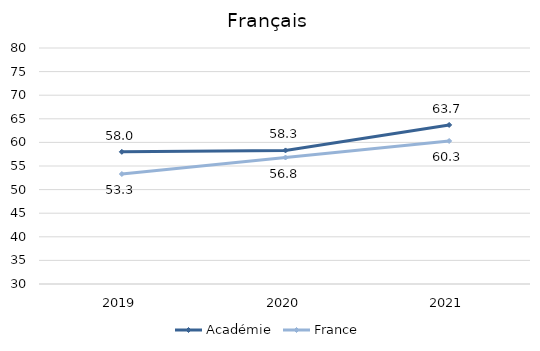
| Category | Académie | France |
|---|---|---|
| 2019.0 | 58 | 53.3 |
| 2020.0 | 58.3 | 56.8 |
| 2021.0 | 63.7 | 60.3 |